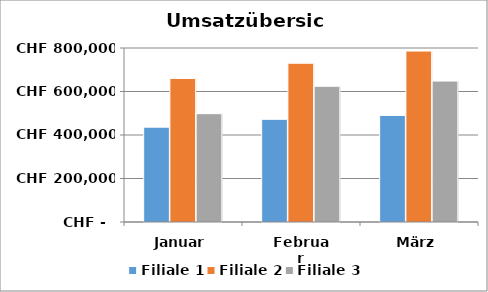
| Category | Filiale 1 | Filiale 2 | Filiale 3 |
|---|---|---|---|
| Januar | 436000 | 660000 | 498000 |
| Februar | 472000 | 730000 | 624000 |
| März | 490000 | 786000 | 648000 |